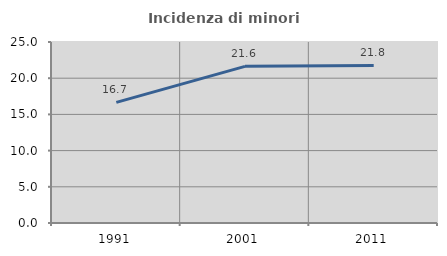
| Category | Incidenza di minori stranieri |
|---|---|
| 1991.0 | 16.667 |
| 2001.0 | 21.635 |
| 2011.0 | 21.756 |